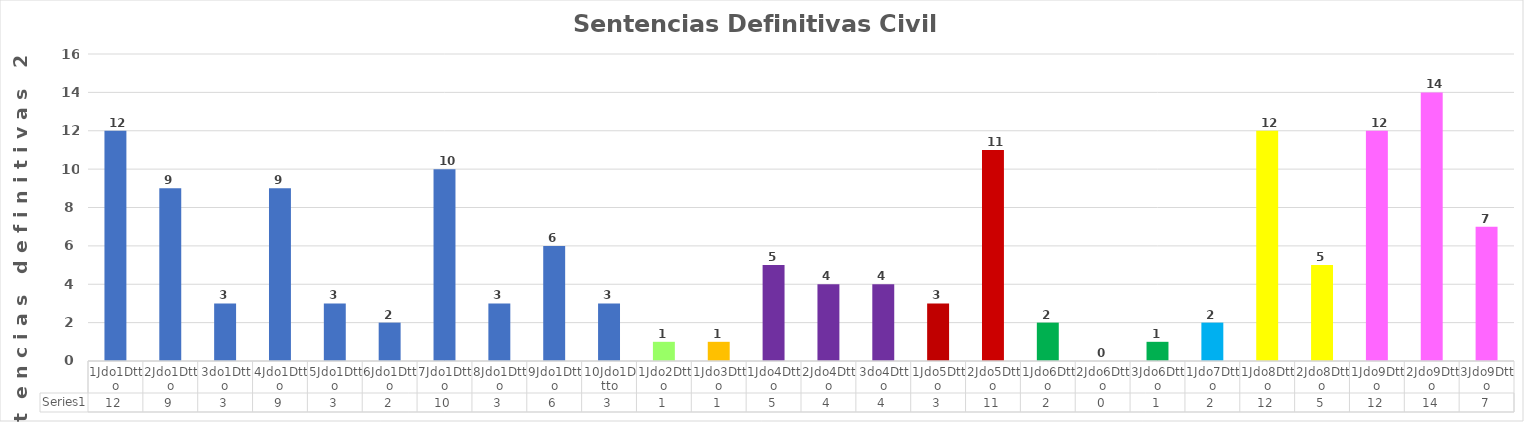
| Category | Series 0 |
|---|---|
| 1Jdo1Dtto | 12 |
| 2Jdo1Dtto | 9 |
| 3do1Dtto | 3 |
| 4Jdo1Dtto | 9 |
| 5Jdo1Dtto | 3 |
| 6Jdo1Dtto | 2 |
| 7Jdo1Dtto | 10 |
| 8Jdo1Dtto | 3 |
| 9Jdo1Dtto | 6 |
| 10Jdo1Dtto | 3 |
| 1Jdo2Dtto | 1 |
| 1Jdo3Dtto | 1 |
| 1Jdo4Dtto | 5 |
| 2Jdo4Dtto | 4 |
| 3do4Dtto | 4 |
| 1Jdo5Dtto | 3 |
| 2Jdo5Dtto | 11 |
| 1Jdo6Dtto | 2 |
| 2Jdo6Dtto | 0 |
| 3Jdo6Dtto | 1 |
| 1Jdo7Dtto | 2 |
| 1Jdo8Dtto | 12 |
| 2Jdo8Dtto | 5 |
| 1Jdo9Dtto | 12 |
| 2Jdo9Dtto | 14 |
| 3Jdo9Dtto | 7 |